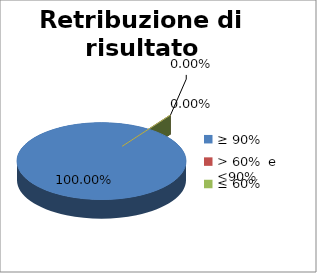
| Category | Retribuzione di risultato dirigenti |
|---|---|
| ≥ 90% | 1 |
| > 60%  e  <90% | 0 |
| ≤ 60% | 0 |